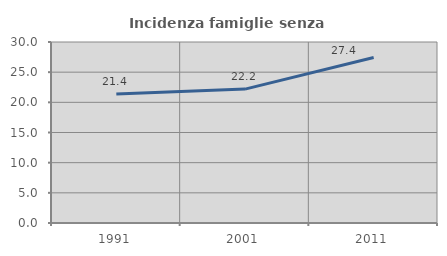
| Category | Incidenza famiglie senza nuclei |
|---|---|
| 1991.0 | 21.39 |
| 2001.0 | 22.196 |
| 2011.0 | 27.429 |